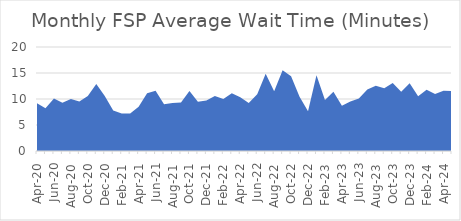
| Category | Average Wait Time (Minutes) |
|---|---|
| 2020-04-01 | 9.2 |
| 2020-05-01 | 8.2 |
| 2020-06-01 | 10.1 |
| 2020-07-01 | 9.3 |
| 2020-08-01 | 10 |
| 2020-09-01 | 9.5 |
| 2020-10-01 | 10.6 |
| 2020-11-01 | 12.9 |
| 2020-12-01 | 10.6 |
| 2021-01-01 | 7.8 |
| 2021-02-01 | 7.2 |
| 2021-03-01 | 7.2 |
| 2021-04-01 | 8.5 |
| 2021-05-01 | 11.1 |
| 2021-06-01 | 11.6 |
| 2021-07-01 | 9 |
| 2021-08-01 | 9.23 |
| 2021-09-01 | 9.33 |
| 2021-10-01 | 11.54 |
| 2021-11-01 | 9.47 |
| 2021-12-01 | 9.7 |
| 2022-01-01 | 10.56 |
| 2022-02-01 | 10.01 |
| 2022-03-01 | 11.12 |
| 2022-04-01 | 10.33 |
| 2022-05-01 | 9.23 |
| 2022-06-01 | 10.9 |
| 2022-07-01 | 14.86 |
| 2022-08-01 | 11.51 |
| 2022-09-01 | 15.54 |
| 2022-10-01 | 14.39 |
| 2022-11-01 | 10.42 |
| 2022-12-01 | 7.65 |
| 2023-01-01 | 14.55 |
| 2023-02-01 | 9.83 |
| 2023-03-01 | 11.38 |
| 2023-04-01 | 8.69 |
| 2023-05-01 | 9.52 |
| 2023-06-01 | 10.11 |
| 2023-07-01 | 11.82 |
| 2023-08-01 | 12.54 |
| 2023-09-01 | 12.08 |
| 2023-10-01 | 13.09 |
| 2023-11-01 | 11.39 |
| 2023-12-01 | 13.01 |
| 2024-01-01 | 10.54 |
| 2024-02-01 | 11.79 |
| 2024-03-01 | 10.96 |
| 2024-04-01 | 11.61 |
| 2024-05-01 | 11.54 |